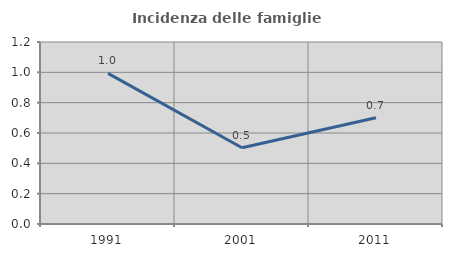
| Category | Incidenza delle famiglie numerose |
|---|---|
| 1991.0 | 0.993 |
| 2001.0 | 0.502 |
| 2011.0 | 0.7 |